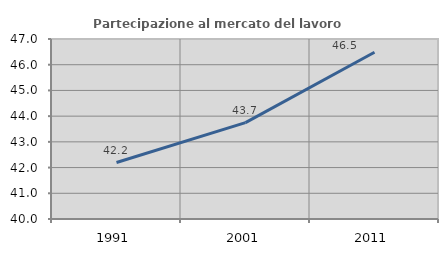
| Category | Partecipazione al mercato del lavoro  femminile |
|---|---|
| 1991.0 | 42.196 |
| 2001.0 | 43.747 |
| 2011.0 | 46.485 |